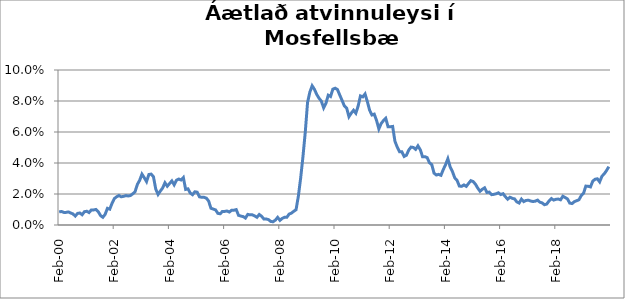
| Category | Series 0 |
|---|---|
| 2000-02-01 | 0.008 |
| 2000-03-01 | 0.009 |
| 2000-04-01 | 0.008 |
| 2000-05-01 | 0.008 |
| 2000-06-01 | 0.008 |
| 2000-07-01 | 0.008 |
| 2000-08-01 | 0.007 |
| 2000-09-01 | 0.006 |
| 2000-10-01 | 0.007 |
| 2000-11-01 | 0.008 |
| 2000-12-01 | 0.007 |
| 2001-01-01 | 0.009 |
| 2001-02-01 | 0.009 |
| 2001-03-01 | 0.008 |
| 2001-04-01 | 0.01 |
| 2001-05-01 | 0.01 |
| 2001-06-01 | 0.01 |
| 2001-07-01 | 0.009 |
| 2001-08-01 | 0.006 |
| 2001-09-01 | 0.005 |
| 2001-10-01 | 0.007 |
| 2001-11-01 | 0.011 |
| 2001-12-01 | 0.01 |
| 2002-01-01 | 0.014 |
| 2002-02-01 | 0.017 |
| 2002-03-01 | 0.018 |
| 2002-04-01 | 0.019 |
| 2002-05-01 | 0.018 |
| 2002-06-01 | 0.018 |
| 2002-07-01 | 0.019 |
| 2002-08-01 | 0.019 |
| 2002-09-01 | 0.019 |
| 2002-10-01 | 0.02 |
| 2002-11-01 | 0.021 |
| 2002-12-01 | 0.026 |
| 2003-01-01 | 0.029 |
| 2003-02-01 | 0.033 |
| 2003-03-01 | 0.031 |
| 2003-04-01 | 0.028 |
| 2003-05-01 | 0.033 |
| 2003-06-01 | 0.033 |
| 2003-07-01 | 0.031 |
| 2003-08-01 | 0.023 |
| 2003-09-01 | 0.02 |
| 2003-10-01 | 0.022 |
| 2003-11-01 | 0.024 |
| 2003-12-01 | 0.027 |
| 2004-01-01 | 0.025 |
| 2004-02-01 | 0.027 |
| 2004-03-01 | 0.028 |
| 2004-04-01 | 0.026 |
| 2004-05-01 | 0.029 |
| 2004-06-01 | 0.03 |
| 2004-07-01 | 0.029 |
| 2004-08-01 | 0.031 |
| 2004-09-01 | 0.023 |
| 2004-10-01 | 0.023 |
| 2004-11-01 | 0.021 |
| 2004-12-01 | 0.02 |
| 2005-01-01 | 0.021 |
| 2005-02-01 | 0.021 |
| 2005-03-01 | 0.018 |
| 2005-04-01 | 0.018 |
| 2005-05-01 | 0.018 |
| 2005-06-01 | 0.017 |
| 2005-07-01 | 0.015 |
| 2005-08-01 | 0.011 |
| 2005-09-01 | 0.01 |
| 2005-10-01 | 0.01 |
| 2005-11-01 | 0.007 |
| 2005-12-01 | 0.007 |
| 2006-01-01 | 0.009 |
| 2006-02-01 | 0.009 |
| 2006-03-01 | 0.009 |
| 2006-04-01 | 0.008 |
| 2006-05-01 | 0.01 |
| 2006-06-01 | 0.01 |
| 2006-07-01 | 0.01 |
| 2006-08-01 | 0.006 |
| 2006-09-01 | 0.006 |
| 2006-10-01 | 0.005 |
| 2006-11-01 | 0.004 |
| 2006-12-01 | 0.007 |
| 2007-01-01 | 0.007 |
| 2007-02-01 | 0.007 |
| 2007-03-01 | 0.006 |
| 2007-04-01 | 0.005 |
| 2007-05-01 | 0.007 |
| 2007-06-01 | 0.006 |
| 2007-07-01 | 0.004 |
| 2007-08-01 | 0.004 |
| 2007-09-01 | 0.003 |
| 2007-10-01 | 0.002 |
| 2007-11-01 | 0.002 |
| 2007-12-01 | 0.003 |
| 2008-01-01 | 0.005 |
| 2008-02-01 | 0.003 |
| 2008-03-01 | 0.004 |
| 2008-04-01 | 0.005 |
| 2008-05-01 | 0.005 |
| 2008-06-01 | 0.007 |
| 2008-07-01 | 0.008 |
| 2008-08-01 | 0.009 |
| 2008-09-01 | 0.01 |
| 2008-10-01 | 0.019 |
| 2008-11-01 | 0.03 |
| 2008-12-01 | 0.044 |
| 2009-01-01 | 0.06 |
| 2009-02-01 | 0.079 |
| 2009-03-01 | 0.086 |
| 2009-04-01 | 0.09 |
| 2009-05-01 | 0.088 |
| 2009-06-01 | 0.084 |
| 2009-07-01 | 0.082 |
| 2009-08-01 | 0.08 |
| 2009-09-01 | 0.076 |
| 2009-10-01 | 0.079 |
| 2009-11-01 | 0.084 |
| 2009-12-01 | 0.083 |
| 2010-01-01 | 0.088 |
| 2010-02-01 | 0.088 |
| 2010-03-01 | 0.087 |
| 2010-04-01 | 0.084 |
| 2010-05-01 | 0.08 |
| 2010-06-01 | 0.077 |
| 2010-07-01 | 0.075 |
| 2010-08-01 | 0.07 |
| 2010-09-01 | 0.072 |
| 2010-10-01 | 0.074 |
| 2010-11-01 | 0.072 |
| 2010-12-01 | 0.077 |
| 2011-01-01 | 0.083 |
| 2011-02-01 | 0.083 |
| 2011-03-01 | 0.085 |
| 2011-04-01 | 0.08 |
| 2011-05-01 | 0.074 |
| 2011-06-01 | 0.071 |
| 2011-07-01 | 0.072 |
| 2011-08-01 | 0.067 |
| 2011-09-01 | 0.062 |
| 2011-10-01 | 0.065 |
| 2011-11-01 | 0.067 |
| 2011-12-01 | 0.069 |
| 2012-01-01 | 0.063 |
| 2012-02-01 | 0.063 |
| 2012-03-01 | 0.064 |
| 2012-04-01 | 0.054 |
| 2012-05-01 | 0.05 |
| 2012-06-01 | 0.047 |
| 2012-07-01 | 0.047 |
| 2012-08-01 | 0.044 |
| 2012-09-01 | 0.045 |
| 2012-10-01 | 0.048 |
| 2012-11-01 | 0.05 |
| 2012-12-01 | 0.05 |
| 2013-01-01 | 0.049 |
| 2013-02-01 | 0.051 |
| 2013-03-01 | 0.049 |
| 2013-04-01 | 0.044 |
| 2013-05-01 | 0.044 |
| 2013-06-01 | 0.043 |
| 2013-07-01 | 0.04 |
| 2013-08-01 | 0.039 |
| 2013-09-01 | 0.033 |
| 2013-10-01 | 0.032 |
| 2013-11-01 | 0.033 |
| 2013-12-01 | 0.032 |
| 2014-01-01 | 0.036 |
| 2014-02-01 | 0.039 |
| 2014-03-01 | 0.043 |
| 2014-04-01 | 0.037 |
| 2014-05-01 | 0.034 |
| 2014-06-01 | 0.03 |
| 2014-07-01 | 0.029 |
| 2014-08-01 | 0.025 |
| 2014-09-01 | 0.025 |
| 2014-10-01 | 0.026 |
| 2014-11-01 | 0.025 |
| 2014-12-01 | 0.027 |
| 2015-01-01 | 0.029 |
| 2015-02-01 | 0.028 |
| 2015-03-01 | 0.026 |
| 2015-04-01 | 0.024 |
| 2015-05-01 | 0.022 |
| 2015-06-01 | 0.023 |
| 2015-07-01 | 0.024 |
| 2015-08-01 | 0.021 |
| 2015-09-01 | 0.021 |
| 2015-10-01 | 0.02 |
| 2015-11-01 | 0.02 |
| 2015-12-01 | 0.02 |
| 2016-01-01 | 0.021 |
| 2016-02-01 | 0.02 |
| 2016-03-01 | 0.02 |
| 2016-04-01 | 0.018 |
| 2016-05-01 | 0.017 |
| 2016-06-01 | 0.018 |
| 2016-07-01 | 0.017 |
| 2016-08-01 | 0.017 |
| 2016-09-01 | 0.015 |
| 2016-10-01 | 0.014 |
| 2016-11-01 | 0.017 |
| 2016-12-01 | 0.015 |
| 2017-01-01 | 0.016 |
| 2017-02-01 | 0.016 |
| 2017-03-01 | 0.015 |
| 2017-04-01 | 0.015 |
| 2017-05-01 | 0.015 |
| 2017-06-01 | 0.016 |
| 2017-07-01 | 0.015 |
| 2017-08-01 | 0.014 |
| 2017-09-01 | 0.013 |
| 2017-10-01 | 0.014 |
| 2017-11-01 | 0.016 |
| 2017-12-01 | 0.017 |
| 2018-01-01 | 0.016 |
| 2018-02-01 | 0.017 |
| 2018-03-01 | 0.017 |
| 2018-04-01 | 0.016 |
| 2018-05-01 | 0.019 |
| 2018-06-01 | 0.018 |
| 2018-07-01 | 0.017 |
| 2018-08-01 | 0.014 |
| 2018-09-01 | 0.014 |
| 2018-10-01 | 0.015 |
| 2018-11-01 | 0.016 |
| 2018-12-01 | 0.016 |
| 2019-01-01 | 0.019 |
| 2019-02-01 | 0.021 |
| 2019-03-01 | 0.025 |
| 2019-04-01 | 0.025 |
| 2019-05-01 | 0.025 |
| 2019-06-01 | 0.028 |
| 2019-07-01 | 0.03 |
| 2019-08-01 | 0.03 |
| 2019-09-01 | 0.028 |
| 2019-10-01 | 0.031 |
| 2019-11-01 | 0.033 |
| 2019-12-01 | 0.035 |
| 2020-01-01 | 0.038 |